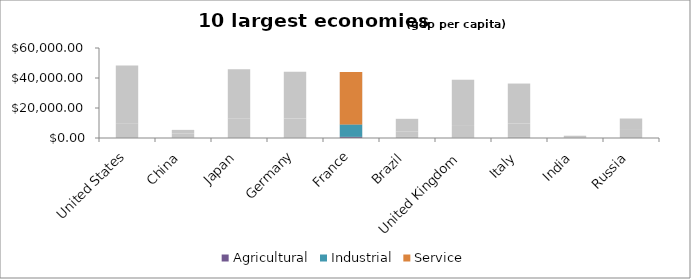
| Category | Agricultural | Industrial | Service |
|---|---|---|---|
| United States | 579.936 | 9278.976 | 38469.088 |
| China | 541.7 | 2524.322 | 2345.561 |
| Japan | 550.44 | 12522.51 | 32842.92 |
| Germany | 352.888 | 12615.746 | 31142.366 |
| France | 792.126 | 8229.309 | 34985.565 |
| Brazil | 703.395 | 3516.975 | 8568.63 |
| United Kingdom | 271.677 | 8344.365 | 30194.958 |
| Italy | 725.34 | 8957.949 | 26619.978 |
| India | 260.408 | 399.696 | 853.896 |
| Russia | 584.685 | 4794.417 | 7613.898 |